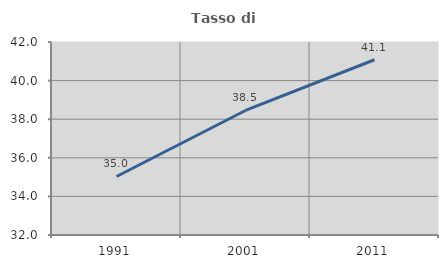
| Category | Tasso di occupazione   |
|---|---|
| 1991.0 | 35.032 |
| 2001.0 | 38.452 |
| 2011.0 | 41.081 |